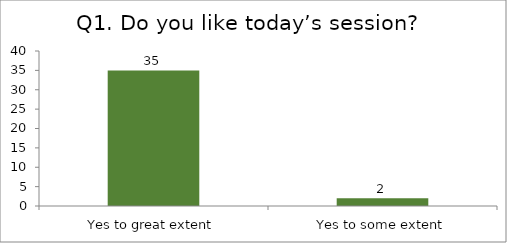
| Category | Q1. Do you like today’s session? |
|---|---|
| Yes to great extent | 35 |
| Yes to some extent | 2 |